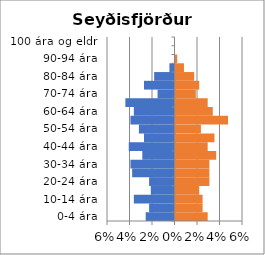
| Category | % karlar | %konur |
|---|---|---|
| 0-4 ára | -0.026 | 0.029 |
| 5-9 ára | -0.023 | 0.024 |
| 10-14 ára | -0.036 | 0.024 |
| 15-19 ára | -0.021 | 0.021 |
| 20-24 ára | -0.023 | 0.03 |
| 25-29 ára | -0.038 | 0.03 |
| 30-34 ára | -0.039 | 0.03 |
| 35-39 ára | -0.029 | 0.036 |
| 40-44 ára | -0.041 | 0.029 |
| 45-49 ára | -0.027 | 0.035 |
| 50-54 ára | -0.032 | 0.023 |
| 55-59 ára | -0.039 | 0.047 |
| 60-64 ára | -0.036 | 0.033 |
| 65-69 ára | -0.044 | 0.029 |
| 70-74 ára | -0.015 | 0.018 |
| 75-79 ára | -0.027 | 0.021 |
| 80-84 ára | -0.018 | 0.017 |
| 85-89 ára | -0.005 | 0.008 |
| 90-94 ára | 0 | 0.002 |
| 95-99 ára | 0 | 0 |
| 100 ára og eldri | 0 | 0 |